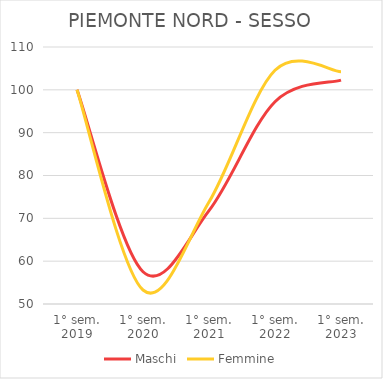
| Category | Maschi | Femmine |
|---|---|---|
| 1° sem.
2019 | 100 | 100 |
| 1° sem.
2020 | 57.532 | 53.268 |
| 1° sem.
2021 | 71.804 | 73.799 |
| 1° sem.
2022 | 97.231 | 104.567 |
| 1° sem.
2023 | 102.278 | 104.204 |